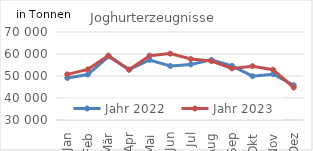
| Category | Jahr 2022 | Jahr 2023 |
|---|---|---|
| Jan | 49110.195 | 50757.218 |
| Feb | 50677.036 | 53014.09 |
| Mär | 58845.403 | 59276.627 |
| Apr | 52901.836 | 52858.755 |
| Mai | 57269.631 | 59249.135 |
| Jun | 54564.816 | 60177.245 |
| Jul | 55250.108 | 57702.914 |
| Aug | 57331.306 | 56791.651 |
| Sep | 54635.572 | 53449.741 |
| Okt | 49918.852 | 54468.664 |
| Nov | 50832.531 | 52848.349 |
| Dez | 45814.67 | 44771.548 |